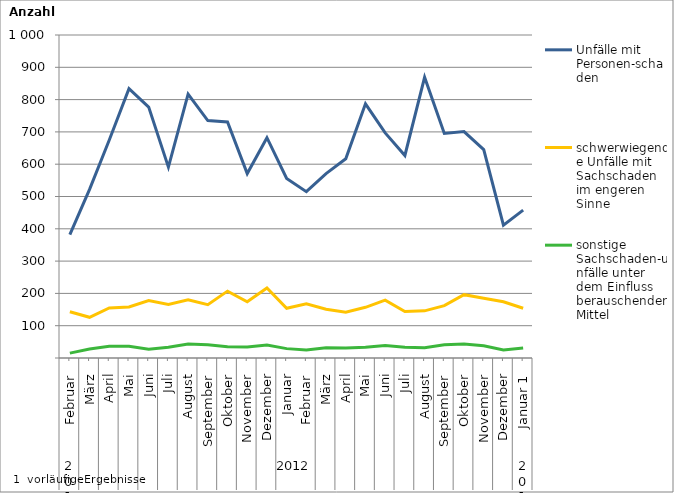
| Category | Unfälle mit Personen-schaden | schwerwiegende Unfälle mit Sachschaden   im engeren Sinne | sonstige Sachschaden-unfälle unter dem Einfluss berauschender Mittel |
|---|---|---|---|
| 0 | 382 | 143 | 15 |
| 1 | 522 | 126 | 28 |
| 2 | 675 | 155 | 36 |
| 3 | 834 | 158 | 36 |
| 4 | 777 | 178 | 27 |
| 5 | 591 | 166 | 33 |
| 6 | 817 | 180 | 43 |
| 7 | 735 | 165 | 41 |
| 8 | 731 | 207 | 35 |
| 9 | 571 | 174 | 34 |
| 10 | 682 | 217 | 40 |
| 11 | 556 | 154 | 29 |
| 12 | 515 | 168 | 25 |
| 13 | 571 | 151 | 32 |
| 14 | 617 | 142 | 31 |
| 15 | 787 | 157 | 33 |
| 16 | 697 | 179 | 39 |
| 17 | 627 | 144 | 33 |
| 18 | 869 | 146 | 32 |
| 19 | 695 | 162 | 41 |
| 20 | 701 | 196 | 43 |
| 21 | 645 | 185 | 38 |
| 22 | 411 | 174 | 25 |
| 23 | 458 | 154 | 31 |